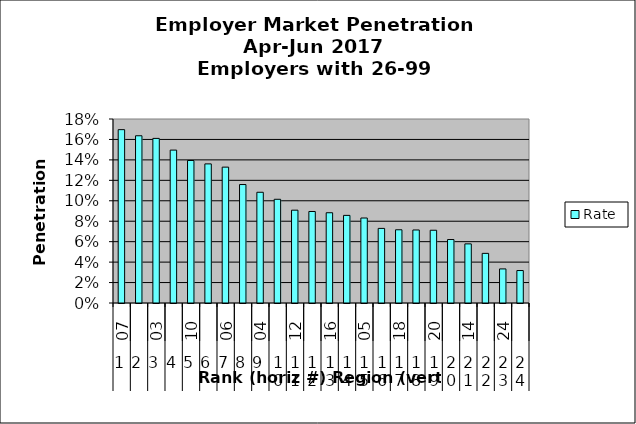
| Category | Rate |
|---|---|
| 0 | 0.17 |
| 1 | 0.164 |
| 2 | 0.161 |
| 3 | 0.15 |
| 4 | 0.139 |
| 5 | 0.136 |
| 6 | 0.133 |
| 7 | 0.116 |
| 8 | 0.108 |
| 9 | 0.101 |
| 10 | 0.091 |
| 11 | 0.09 |
| 12 | 0.088 |
| 13 | 0.086 |
| 14 | 0.083 |
| 15 | 0.073 |
| 16 | 0.072 |
| 17 | 0.071 |
| 18 | 0.071 |
| 19 | 0.062 |
| 20 | 0.058 |
| 21 | 0.049 |
| 22 | 0.033 |
| 23 | 0.032 |